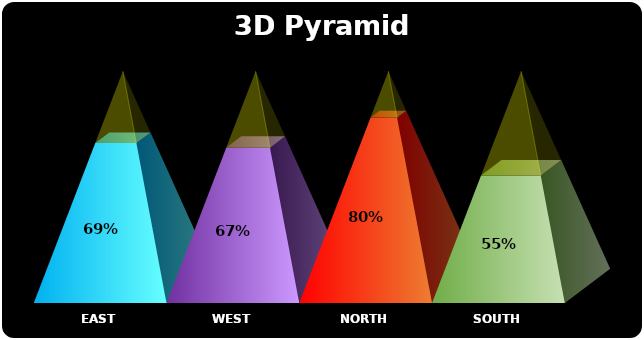
| Category | Sales Conversion% | Transparent Slice |
|---|---|---|
| EAST | 0.69 | 0.31 |
| WEST | 0.67 | 0.33 |
| NORTH | 0.8 | 0.2 |
| SOUTH | 0.55 | 0.45 |